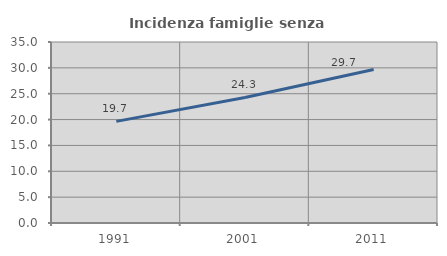
| Category | Incidenza famiglie senza nuclei |
|---|---|
| 1991.0 | 19.653 |
| 2001.0 | 24.281 |
| 2011.0 | 29.682 |